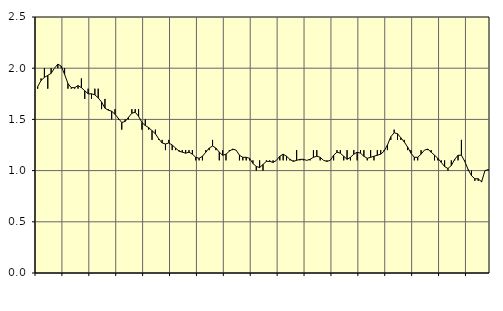
| Category | Piggar | Jordbruk, skogsbruk o fiske, SNI 01-03 |
|---|---|---|
| nan | 1.8 | 1.82 |
| 87.0 | 1.9 | 1.88 |
| 87.0 | 2 | 1.91 |
| 87.0 | 1.8 | 1.93 |
| nan | 2 | 1.95 |
| 88.0 | 2 | 2 |
| 88.0 | 2 | 2.04 |
| 88.0 | 2 | 2.02 |
| nan | 2 | 1.94 |
| 89.0 | 1.8 | 1.85 |
| 89.0 | 1.8 | 1.81 |
| 89.0 | 1.8 | 1.81 |
| nan | 1.8 | 1.83 |
| 90.0 | 1.9 | 1.81 |
| 90.0 | 1.7 | 1.78 |
| 90.0 | 1.8 | 1.75 |
| nan | 1.7 | 1.75 |
| 91.0 | 1.8 | 1.74 |
| 91.0 | 1.8 | 1.71 |
| 91.0 | 1.6 | 1.67 |
| nan | 1.7 | 1.61 |
| 92.0 | 1.6 | 1.59 |
| 92.0 | 1.5 | 1.58 |
| 92.0 | 1.6 | 1.55 |
| nan | 1.5 | 1.51 |
| 93.0 | 1.4 | 1.47 |
| 93.0 | 1.5 | 1.48 |
| 93.0 | 1.5 | 1.52 |
| nan | 1.6 | 1.56 |
| 94.0 | 1.6 | 1.57 |
| 94.0 | 1.6 | 1.53 |
| 94.0 | 1.4 | 1.47 |
| nan | 1.5 | 1.44 |
| 95.0 | 1.4 | 1.42 |
| 95.0 | 1.3 | 1.39 |
| 95.0 | 1.4 | 1.36 |
| nan | 1.3 | 1.31 |
| 96.0 | 1.3 | 1.27 |
| 96.0 | 1.2 | 1.26 |
| 96.0 | 1.3 | 1.27 |
| nan | 1.2 | 1.25 |
| 97.0 | 1.2 | 1.22 |
| 97.0 | 1.2 | 1.19 |
| 97.0 | 1.2 | 1.18 |
| nan | 1.2 | 1.17 |
| 98.0 | 1.2 | 1.18 |
| 98.0 | 1.2 | 1.16 |
| 98.0 | 1.1 | 1.13 |
| nan | 1.1 | 1.12 |
| 99.0 | 1.1 | 1.14 |
| 99.0 | 1.2 | 1.18 |
| 99.0 | 1.2 | 1.22 |
| nan | 1.3 | 1.24 |
| 0.0 | 1.2 | 1.22 |
| 0.0 | 1.1 | 1.18 |
| 0.0 | 1.2 | 1.15 |
| nan | 1.1 | 1.16 |
| 1.0 | 1.2 | 1.19 |
| 1.0 | 1.2 | 1.21 |
| 1.0 | 1.2 | 1.2 |
| nan | 1.1 | 1.15 |
| 2.0 | 1.1 | 1.13 |
| 2.0 | 1.1 | 1.13 |
| 2.0 | 1.1 | 1.12 |
| nan | 1.1 | 1.07 |
| 3.0 | 1 | 1.04 |
| 3.0 | 1.1 | 1.03 |
| 3.0 | 1 | 1.06 |
| nan | 1.1 | 1.09 |
| 4.0 | 1.1 | 1.09 |
| 4.0 | 1.1 | 1.08 |
| 4.0 | 1.1 | 1.1 |
| nan | 1.1 | 1.14 |
| 5.0 | 1.1 | 1.16 |
| 5.0 | 1.1 | 1.14 |
| 5.0 | 1.1 | 1.11 |
| nan | 1.1 | 1.09 |
| 6.0 | 1.2 | 1.1 |
| 6.0 | 1.1 | 1.11 |
| 6.0 | 1.1 | 1.11 |
| nan | 1.1 | 1.1 |
| 7.0 | 1.1 | 1.11 |
| 7.0 | 1.2 | 1.13 |
| 7.0 | 1.2 | 1.14 |
| nan | 1.1 | 1.13 |
| 8.0 | 1.1 | 1.1 |
| 8.0 | 1.1 | 1.09 |
| 8.0 | 1.1 | 1.1 |
| nan | 1.1 | 1.15 |
| 9.0 | 1.2 | 1.18 |
| 9.0 | 1.2 | 1.17 |
| 9.0 | 1.1 | 1.14 |
| nan | 1.2 | 1.11 |
| 10.0 | 1.1 | 1.13 |
| 10.0 | 1.2 | 1.16 |
| 10.0 | 1.1 | 1.18 |
| nan | 1.2 | 1.17 |
| 11.0 | 1.2 | 1.14 |
| 11.0 | 1.1 | 1.12 |
| 11.0 | 1.2 | 1.13 |
| nan | 1.1 | 1.14 |
| 12.0 | 1.2 | 1.15 |
| 12.0 | 1.2 | 1.16 |
| 12.0 | 1.2 | 1.19 |
| nan | 1.2 | 1.25 |
| 13.0 | 1.3 | 1.33 |
| 13.0 | 1.4 | 1.37 |
| 13.0 | 1.3 | 1.36 |
| nan | 1.3 | 1.32 |
| 14.0 | 1.3 | 1.28 |
| 14.0 | 1.2 | 1.23 |
| 14.0 | 1.2 | 1.17 |
| nan | 1.1 | 1.13 |
| 15.0 | 1.1 | 1.13 |
| 15.0 | 1.2 | 1.16 |
| 15.0 | 1.2 | 1.2 |
| nan | 1.2 | 1.21 |
| 16.0 | 1.2 | 1.18 |
| 16.0 | 1.1 | 1.15 |
| 16.0 | 1.1 | 1.12 |
| nan | 1.1 | 1.08 |
| 17.0 | 1.1 | 1.04 |
| 17.0 | 1 | 1.02 |
| 17.0 | 1.1 | 1.05 |
| nan | 1.1 | 1.11 |
| 18.0 | 1.1 | 1.15 |
| 18.0 | 1.3 | 1.15 |
| 18.0 | 1.1 | 1.09 |
| nan | 1 | 1.01 |
| 19.0 | 1 | 0.95 |
| 19.0 | 0.9 | 0.92 |
| 19.0 | 0.9 | 0.92 |
| nan | 0.9 | 0.89 |
| 20.0 | 1 | 1 |
| 20.0 | 1 | 1.01 |